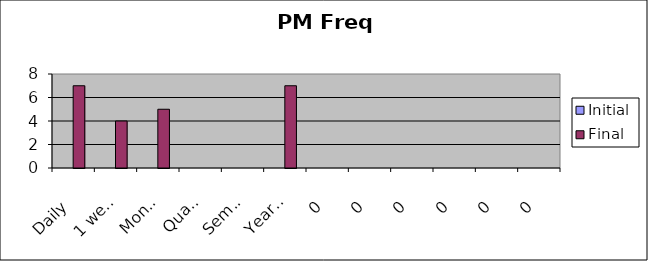
| Category | Initial | Final  |
|---|---|---|
| Daily | 0 | 7 |
| 1 week | 0 | 4 |
| Monthly | 0 | 5 |
| Quarterly | 0 | 0 |
| Semi Annual | 0 | 0 |
| Yearly | 0 | 7 |
| 0 | 0 | 0 |
| 0 | 0 | 0 |
| 0 | 0 | 0 |
| 0 | 0 | 0 |
| 0 | 0 | 0 |
| 0 | 0 | 0 |